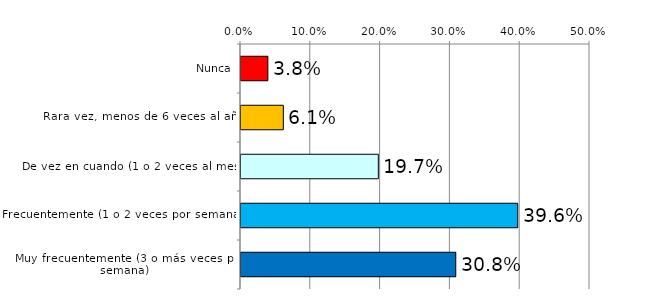
| Category | Series 1 |
|---|---|
| Nunca | 0.038 |
| Rara vez, menos de 6 veces al año | 0.061 |
| De vez en cuando (1 o 2 veces al mes) | 0.197 |
| Frecuentemente (1 o 2 veces por semana) | 0.396 |
| Muy frecuentemente (3 o más veces por semana) | 0.308 |